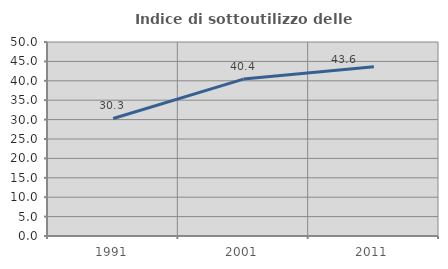
| Category | Indice di sottoutilizzo delle abitazioni  |
|---|---|
| 1991.0 | 30.289 |
| 2001.0 | 40.443 |
| 2011.0 | 43.645 |